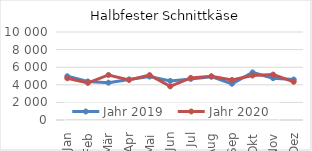
| Category | Jahr 2019 | Jahr 2020 |
|---|---|---|
| Jan | 4967.849 | 4745.747 |
| Feb | 4377.904 | 4217.787 |
| Mär | 4239.089 | 5118.093 |
| Apr | 4611.937 | 4550.913 |
| Mai | 4937.934 | 5100.686 |
| Jun | 4438.641 | 3817.508 |
| Jul | 4671.223 | 4782.03 |
| Aug | 4922.342 | 4969.602 |
| Sep | 4119.064 | 4548.253 |
| Okt | 5404.873 | 5056.063 |
| Nov | 4751.718 | 5161.928 |
| Dez | 4602.229 | 4340.008 |